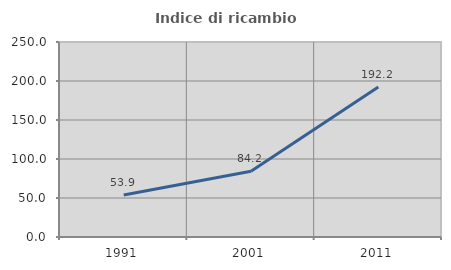
| Category | Indice di ricambio occupazionale  |
|---|---|
| 1991.0 | 53.861 |
| 2001.0 | 84.199 |
| 2011.0 | 192.182 |